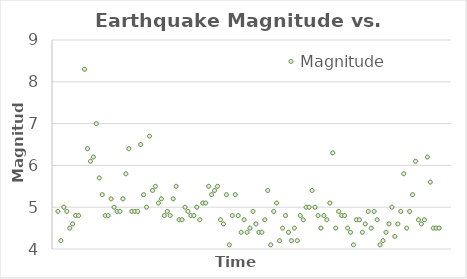
| Category | Magnitude |
|---|---|
| 0 | 3.8 |
| 1 | 4.9 |
| 2 | 4.2 |
| 3 | 5 |
| 4 | 4.9 |
| 5 | 4.5 |
| 6 | 4.6 |
| 7 | 4.8 |
| 8 | 4.8 |
| 9 | 0 |
| 10 | 8.3 |
| 11 | 6.4 |
| 12 | 6.1 |
| 13 | 6.2 |
| 14 | 7 |
| 15 | 5.7 |
| 16 | 5.3 |
| 17 | 4.8 |
| 18 | 4.8 |
| 19 | 5.2 |
| 20 | 5 |
| 21 | 4.9 |
| 22 | 4.9 |
| 23 | 5.2 |
| 24 | 5.8 |
| 25 | 6.4 |
| 26 | 4.9 |
| 27 | 4.9 |
| 28 | 4.9 |
| 29 | 6.5 |
| 30 | 5.3 |
| 31 | 5 |
| 32 | 6.7 |
| 33 | 5.4 |
| 34 | 5.5 |
| 35 | 5.1 |
| 36 | 5.2 |
| 37 | 4.8 |
| 38 | 4.9 |
| 39 | 4.8 |
| 40 | 5.2 |
| 41 | 5.5 |
| 42 | 4.7 |
| 43 | 4.7 |
| 44 | 5 |
| 45 | 4.9 |
| 46 | 4.8 |
| 47 | 4.8 |
| 48 | 5 |
| 49 | 4.7 |
| 50 | 5.1 |
| 51 | 5.1 |
| 52 | 5.5 |
| 53 | 5.3 |
| 54 | 5.4 |
| 55 | 5.5 |
| 56 | 4.7 |
| 57 | 4.6 |
| 58 | 5.3 |
| 59 | 4.1 |
| 60 | 4.8 |
| 61 | 5.3 |
| 62 | 4.8 |
| 63 | 4.4 |
| 64 | 4.7 |
| 65 | 4.4 |
| 66 | 4.5 |
| 67 | 4.9 |
| 68 | 4.6 |
| 69 | 4.4 |
| 70 | 4.4 |
| 71 | 4.7 |
| 72 | 5.4 |
| 73 | 4.1 |
| 74 | 4.9 |
| 75 | 5.1 |
| 76 | 4.2 |
| 77 | 4.5 |
| 78 | 4.8 |
| 79 | 4.4 |
| 80 | 4.2 |
| 81 | 4.5 |
| 82 | 4.2 |
| 83 | 4.8 |
| 84 | 4.7 |
| 85 | 5 |
| 86 | 5 |
| 87 | 5.4 |
| 88 | 5 |
| 89 | 4.8 |
| 90 | 4.5 |
| 91 | 4.8 |
| 92 | 4.7 |
| 93 | 5.1 |
| 94 | 6.3 |
| 95 | 4.5 |
| 96 | 4.9 |
| 97 | 4.8 |
| 98 | 4.8 |
| 99 | 4.5 |
| 100 | 4.4 |
| 101 | 4.1 |
| 102 | 4.7 |
| 103 | 4.7 |
| 104 | 4.4 |
| 105 | 4.6 |
| 106 | 4.9 |
| 107 | 4.5 |
| 108 | 4.9 |
| 109 | 4.7 |
| 110 | 4.1 |
| 111 | 4.2 |
| 112 | 4.4 |
| 113 | 4.6 |
| 114 | 5 |
| 115 | 4.3 |
| 116 | 4.6 |
| 117 | 4.9 |
| 118 | 5.8 |
| 119 | 4.5 |
| 120 | 4.9 |
| 121 | 5.3 |
| 122 | 6.1 |
| 123 | 4.7 |
| 124 | 4.6 |
| 125 | 4.7 |
| 126 | 6.2 |
| 127 | 5.6 |
| 128 | 4.5 |
| 129 | 4.5 |
| 130 | 4.5 |